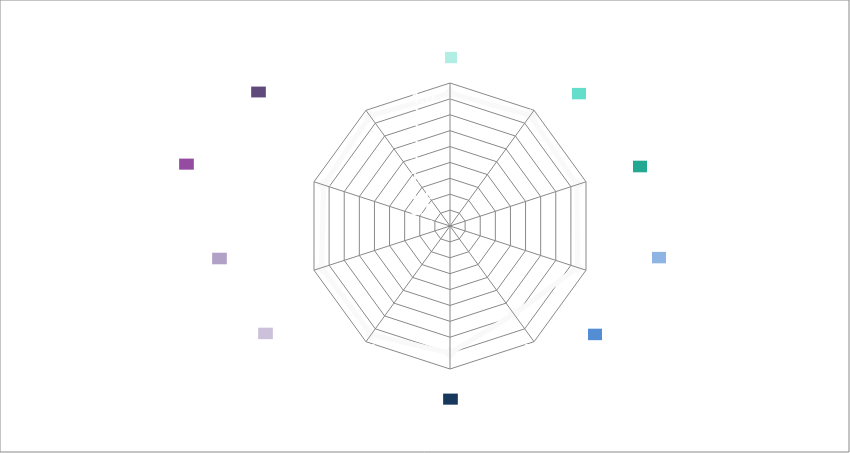
| Category | Series 0 |
|---|---|
| Use | 4.182 |
| Access | 4.3 |
| Space | 4.2 |
| Performance | 4.222 |
| Engineering | 3.429 |
| Construction | 4 |
| Character and Innovation | 4.222 |
| Form and Materials | 4.25 |
| Staff and Patient Environment | 4.182 |
| Urban and Social Integration | 4.286 |